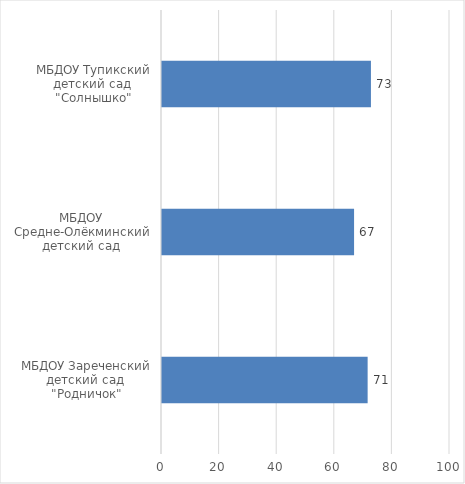
| Category | Series 0 |
|---|---|
| МБДОУ Зареченский детский сад  "Родничок" | 71.401 |
| МБДОУ  Средне-Олёкминский детский сад  | 66.691 |
| МБДОУ Тупикский детский сад  "Солнышко" | 72.548 |